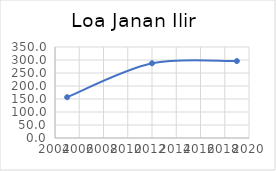
| Category | Series 0 |
|---|---|
| 2005.0 | 156.852 |
| 2012.0 | 287.358 |
| 2019.0 | 295.925 |